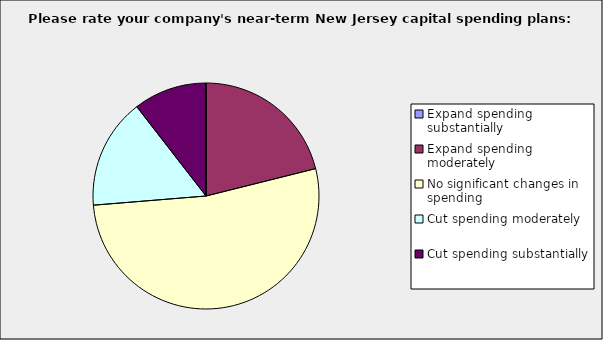
| Category | Series 0 |
|---|---|
| Expand spending substantially | 0 |
| Expand spending moderately | 0.211 |
| No significant changes in spending | 0.526 |
| Cut spending moderately | 0.158 |
| Cut spending substantially | 0.105 |